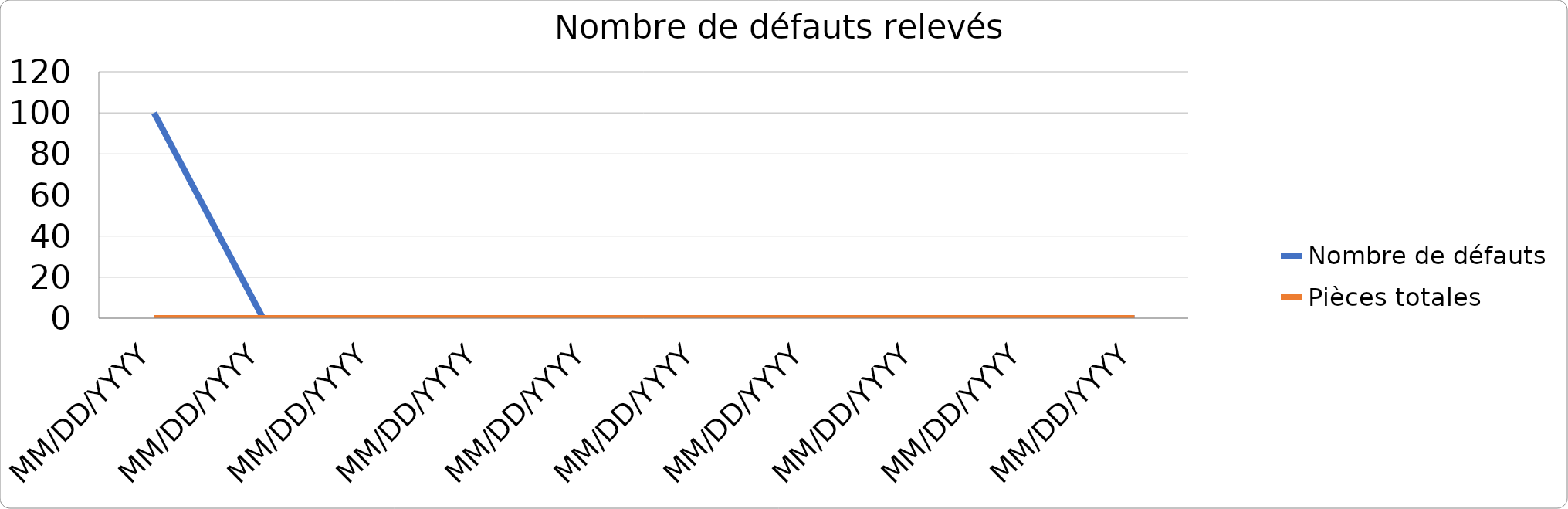
| Category | Nombre de défauts | Pièces totales |
|---|---|---|
| MM/DD/YYYY | 100 | 0 |
| MM/DD/YYYY | 0 | 0 |
| MM/DD/YYYY | 0 | 0 |
| MM/DD/YYYY | 0 | 0 |
| MM/DD/YYYY | 0 | 0 |
| MM/DD/YYYY | 0 | 0 |
| MM/DD/YYYY | 0 | 0 |
| MM/DD/YYYY | 0 | 0 |
| MM/DD/YYYY | 0 | 0 |
| MM/DD/YYYY | 0 | 0 |